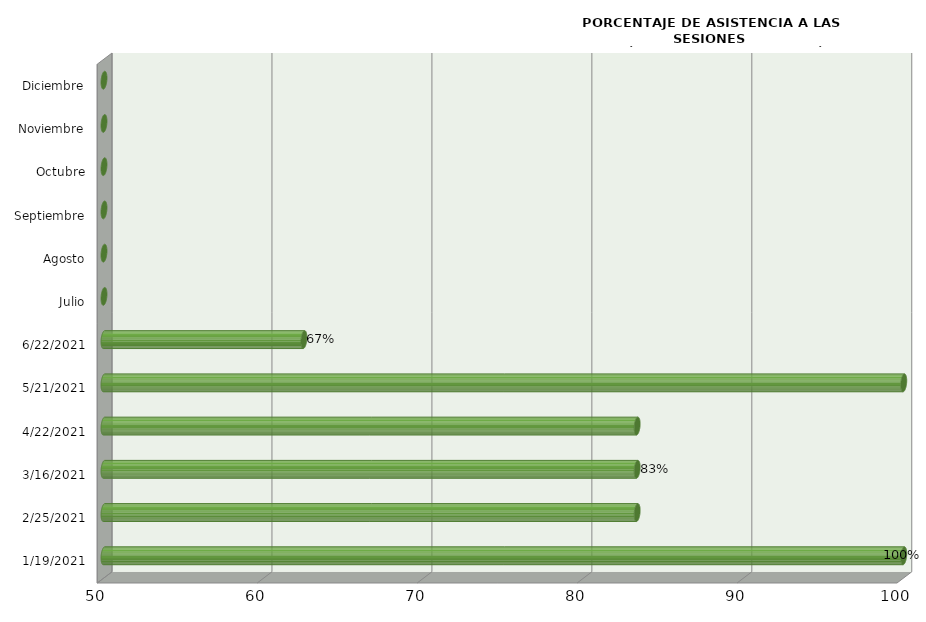
| Category | Series 0 |
|---|---|
| 19/01/2021 | 100 |
| 25/02/2021 | 83.333 |
| 16/03/2021 | 83.333 |
| 22/04/2021 | 83.333 |
| 21/05/2021 | 100 |
| 22/06/2021 | 62.5 |
| Julio | 0 |
| Agosto | 0 |
| Septiembre | 0 |
| Octubre | 0 |
| Noviembre | 0 |
| Diciembre | 0 |